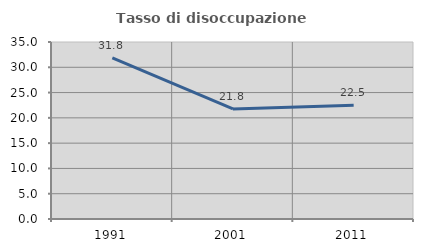
| Category | Tasso di disoccupazione giovanile  |
|---|---|
| 1991.0 | 31.839 |
| 2001.0 | 21.774 |
| 2011.0 | 22.5 |